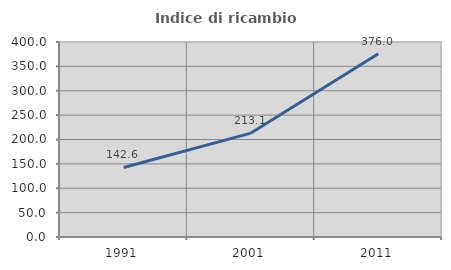
| Category | Indice di ricambio occupazionale  |
|---|---|
| 1991.0 | 142.643 |
| 2001.0 | 213.125 |
| 2011.0 | 376.008 |